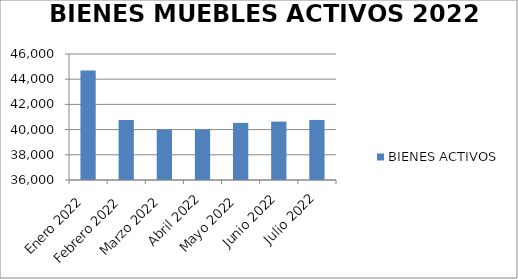
| Category | BIENES ACTIVOS |
|---|---|
| Enero 2022 | 44681 |
| Febrero 2022 | 40762 |
| Marzo 2022 | 40001 |
| Abril 2022 | 40019 |
| Mayo 2022 | 40534 |
| Junio 2022 | 40634 |
| Julio 2022 | 40766 |